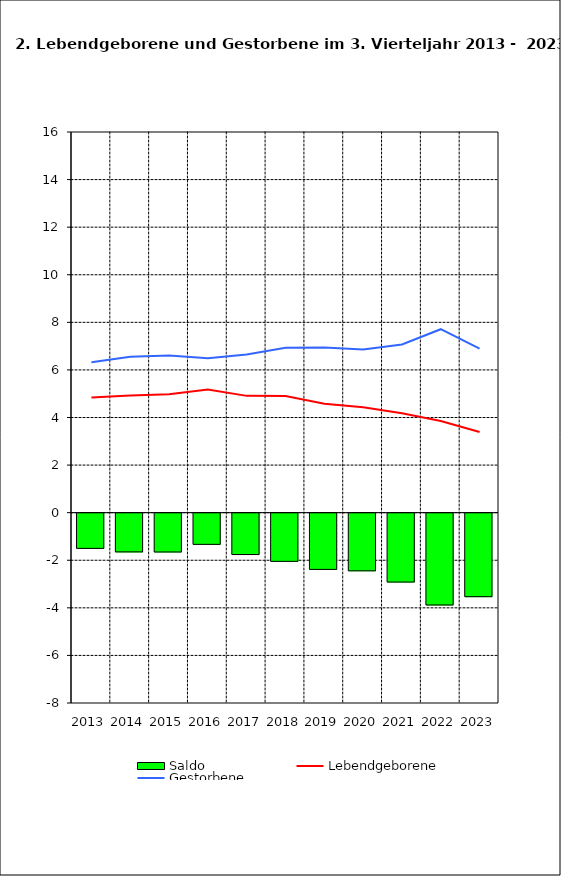
| Category | Saldo |
|---|---|
| 2013.0 | -1.48 |
| 2014.0 | -1.627 |
| 2015.0 | -1.632 |
| 2016.0 | -1.311 |
| 2017.0 | -1.739 |
| 2018.0 | -2.026 |
| 2019.0 | -2.364 |
| 2020.0 | -2.424 |
| 2021.0 | -2.895 |
| 2022.0 | -3.859 |
| 2023.0 | -3.509 |